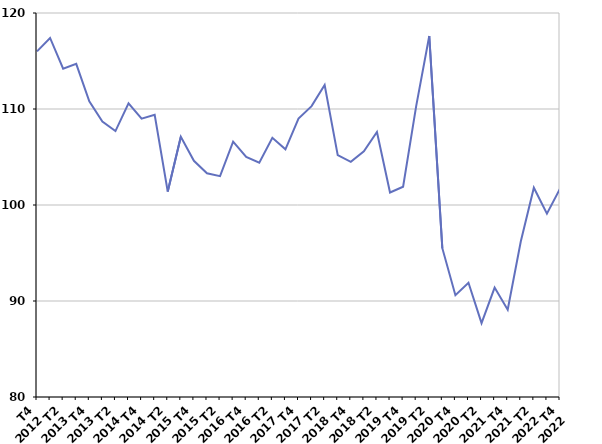
| Category | Fin de contrat |
|---|---|
| T4
2012 | 116 |
| T1
2013 | 117.4 |
| T2
2013 | 114.2 |
| T3
2013 | 114.7 |
| T4
2013 | 110.8 |
| T1
2014 | 108.7 |
| T2
2014 | 107.7 |
| T3
2014 | 110.6 |
| T4
2014 | 109 |
| T1
2015 | 109.4 |
| T2
2015 | 101.4 |
| T3
2015 | 107.1 |
| T4
2015 | 104.6 |
| T1
2016 | 103.3 |
| T2
2016 | 103 |
| T3
2016 | 106.6 |
| T4
2016 | 105 |
| T1
2017 | 104.4 |
| T2
2017 | 107 |
| T3
2017 | 105.8 |
| T4
2017 | 109 |
| T1
2018 | 110.3 |
| T2
2018 | 112.5 |
| T3
2018 | 105.2 |
| T4
2018 | 104.5 |
| T1
2019 | 105.6 |
| T2
2019 | 107.6 |
| T3
2019 | 101.3 |
| T4
2019 | 101.9 |
| T1
2020 | 110.3 |
| T2
2020 | 117.6 |
| T3
2020 | 95.5 |
| T4
2020 | 90.6 |
| T1
2021 | 91.9 |
| T2
2021 | 87.7 |
| T3
2021 | 91.4 |
| T4
2021 | 89.1 |
| T1
2022 | 96.2 |
| T2
2022 | 101.8 |
| T3
2022 | 99.1 |
| T4
2022 | 101.7 |